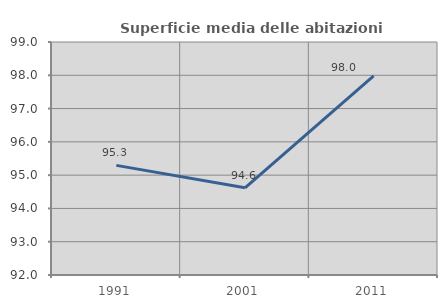
| Category | Superficie media delle abitazioni occupate |
|---|---|
| 1991.0 | 95.294 |
| 2001.0 | 94.62 |
| 2011.0 | 97.982 |